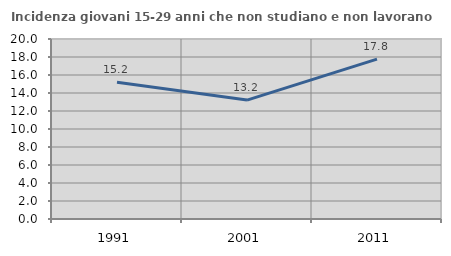
| Category | Incidenza giovani 15-29 anni che non studiano e non lavorano  |
|---|---|
| 1991.0 | 15.186 |
| 2001.0 | 13.213 |
| 2011.0 | 17.758 |